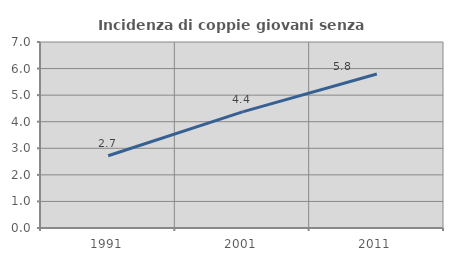
| Category | Incidenza di coppie giovani senza figli |
|---|---|
| 1991.0 | 2.717 |
| 2001.0 | 4.372 |
| 2011.0 | 5.797 |